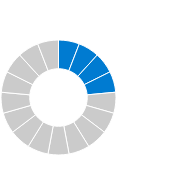
| Category | 2. quarter (actual) |
|---|---|
| 0 | 1 |
| 1 | 1 |
| 2 | 1 |
| 3 | 1 |
| 4 | 1 |
| 5 | 1 |
| 6 | 1 |
| 7 | 1 |
| 8 | 1 |
| 9 | 1 |
| 10 | 1 |
| 11 | 1 |
| 12 | 1 |
| 13 | 1 |
| 14 | 1 |
| 15 | 1 |
| 16 | 1 |